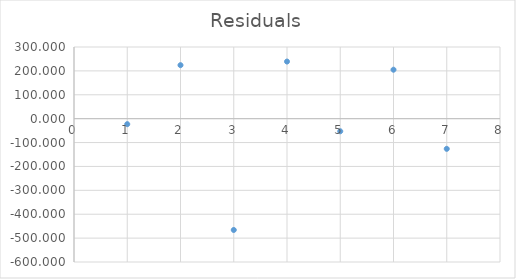
| Category | Residuals |
|---|---|
| 1.0 | -23.009 |
| 2.0 | 223.952 |
| 3.0 | -465.938 |
| 4.0 | 239.117 |
| 5.0 | -52.733 |
| 6.0 | 204.942 |
| 7.0 | -126.33 |